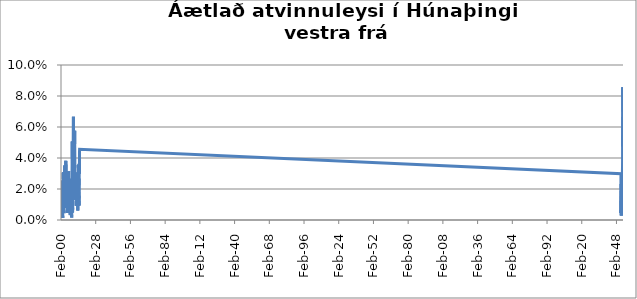
| Category | Series 0 |
|---|---|
| 2000-02-01 | 0.026 |
| 2000-03-01 | 0.024 |
| 2000-04-01 | 0.016 |
| 2000-05-01 | 0.006 |
| 2000-06-01 | 0.003 |
| 2000-07-01 | 0.001 |
| 2000-08-01 | 0.001 |
| 2000-09-01 | 0.004 |
| 2000-10-01 | 0.004 |
| 2000-11-01 | 0.006 |
| 2000-12-01 | 0.013 |
| 2001-01-01 | 0.013 |
| 2001-02-01 | 0.009 |
| 2001-03-01 | 0.013 |
| 2001-04-01 | 0.012 |
| 2001-05-01 | 0.006 |
| 2001-06-01 | 0.001 |
| 2001-07-01 | 0.001 |
| 2001-08-01 | 0.003 |
| 2001-09-01 | 0.003 |
| 2001-10-01 | 0.013 |
| 2001-11-01 | 0.017 |
| 2001-12-01 | 0.031 |
| 2002-01-01 | 0.026 |
| 2002-02-01 | 0.031 |
| 2002-03-01 | 0.023 |
| 2002-04-01 | 0.015 |
| 2002-05-01 | 0.012 |
| 2002-06-01 | 0.006 |
| 2002-07-01 | 0.004 |
| 2002-08-01 | 0.006 |
| 2002-09-01 | 0.012 |
| 2002-10-01 | 0.009 |
| 2002-11-01 | 0.019 |
| 2002-12-01 | 0.028 |
| 2003-01-01 | 0.032 |
| 2003-02-01 | 0.035 |
| 2003-03-01 | 0.025 |
| 2003-04-01 | 0.028 |
| 2003-05-01 | 0.021 |
| 2003-06-01 | 0.015 |
| 2003-07-01 | 0.016 |
| 2003-08-01 | 0.016 |
| 2003-09-01 | 0.019 |
| 2003-10-01 | 0.016 |
| 2003-11-01 | 0.027 |
| 2003-12-01 | 0.027 |
| 2004-01-01 | 0.038 |
| 2004-02-01 | 0.025 |
| 2004-03-01 | 0.024 |
| 2004-04-01 | 0.02 |
| 2004-05-01 | 0.02 |
| 2004-06-01 | 0.009 |
| 2004-07-01 | 0.008 |
| 2004-08-01 | 0.009 |
| 2004-09-01 | 0.008 |
| 2004-10-01 | 0.013 |
| 2004-11-01 | 0.025 |
| 2004-12-01 | 0.022 |
| 2005-01-01 | 0.025 |
| 2005-02-01 | 0.022 |
| 2005-03-01 | 0.022 |
| 2005-04-01 | 0.02 |
| 2005-05-01 | 0.008 |
| 2005-06-01 | 0.006 |
| 2005-07-01 | 0.005 |
| 2005-08-01 | 0.008 |
| 2005-09-01 | 0.005 |
| 2005-10-01 | 0.014 |
| 2005-11-01 | 0.024 |
| 2005-12-01 | 0.027 |
| 2006-01-01 | 0.024 |
| 2006-02-01 | 0.024 |
| 2006-03-01 | 0.028 |
| 2006-04-01 | 0.031 |
| 2006-05-01 | 0.012 |
| 2006-06-01 | 0.007 |
| 2006-07-01 | 0.006 |
| 2006-08-01 | 0.006 |
| 2006-09-01 | 0.006 |
| 2006-10-01 | 0.009 |
| 2006-11-01 | 0.012 |
| 2006-12-01 | 0.016 |
| 2007-01-01 | 0.027 |
| 2007-02-01 | 0.027 |
| 2007-03-01 | 0.02 |
| 2007-04-01 | 0.012 |
| 2007-05-01 | 0.008 |
| 2007-06-01 | 0.005 |
| 2007-07-01 | 0.005 |
| 2007-08-01 | 0.003 |
| 2007-09-01 | 0.006 |
| 2007-10-01 | 0.007 |
| 2007-11-01 | 0.007 |
| 2007-12-01 | 0.007 |
| 2008-01-01 | 0.008 |
| 2008-02-01 | 0.011 |
| 2008-03-01 | 0.015 |
| 2008-04-01 | 0.014 |
| 2008-05-01 | 0.012 |
| 2008-06-01 | 0.006 |
| 2008-07-01 | 0.006 |
| 2008-08-01 | 0.003 |
| 2008-09-01 | 0.002 |
| 2008-10-01 | 0.003 |
| 2008-11-01 | 0.013 |
| 2008-12-01 | 0.017 |
| 2009-01-01 | 0.03 |
| 2009-02-01 | 0.037 |
| 2009-03-01 | 0.051 |
| 2009-04-01 | 0.041 |
| 2009-05-01 | 0.031 |
| 2009-06-01 | 0.005 |
| 2009-07-01 | 0.008 |
| 2009-08-01 | 0.008 |
| 2009-09-01 | 0.015 |
| 2009-10-01 | 0.025 |
| 2009-11-01 | 0.042 |
| 2009-12-01 | 0.047 |
| 2010-01-01 | 0.061 |
| 2010-02-01 | 0.067 |
| 2010-03-01 | 0.061 |
| 2010-04-01 | 0.049 |
| 2010-05-01 | 0.031 |
| 2010-06-01 | 0.016 |
| 2010-07-01 | 0.02 |
| 2010-08-01 | 0.018 |
| 2010-09-01 | 0.013 |
| 2010-10-01 | 0.028 |
| 2010-11-01 | 0.038 |
| 2010-12-01 | 0.043 |
| 2011-01-01 | 0.054 |
| 2011-02-01 | 0.058 |
| 2011-03-01 | 0.049 |
| 2011-04-01 | 0.041 |
| 2011-05-01 | 0.021 |
| 2011-06-01 | 0.021 |
| 2011-07-01 | 0.019 |
| 2011-08-01 | 0.014 |
| 2011-09-01 | 0.014 |
| 2011-10-01 | 0.018 |
| 2011-11-01 | 0.025 |
| 2011-12-01 | 0.028 |
| 2012-01-01 | 0.026 |
| 2012-02-01 | 0.027 |
| 2012-03-01 | 0.021 |
| 2012-04-01 | 0.018 |
| 2012-05-01 | 0.017 |
| 2012-06-01 | 0.009 |
| 2012-07-01 | 0.012 |
| 2012-08-01 | 0.014 |
| 2012-09-01 | 0.016 |
| 2012-10-01 | 0.023 |
| 2012-11-01 | 0.031 |
| 2012-12-01 | 0.031 |
| 2013-01-01 | 0.027 |
| 2013-02-01 | 0.026 |
| 2013-03-01 | 0.013 |
| 2013-04-01 | 0.012 |
| 2013-05-01 | 0.012 |
| 2013-06-01 | 0.012 |
| 2013-07-01 | 0.012 |
| 2013-08-01 | 0.011 |
| 2013-09-01 | 0.006 |
| 2013-10-01 | 0.014 |
| 2013-11-01 | 0.019 |
| 2013-12-01 | 0.027 |
| 2014-01-01 | 0.036 |
| 2014-02-01 | 0.034 |
| 2014-03-01 | 0.031 |
| 2014-04-01 | 0.025 |
| 2014-05-01 | 0.014 |
| 2014-06-01 | 0.016 |
| 2014-07-01 | 0.016 |
| 2014-08-01 | 0.009 |
| 2014-09-01 | 0.009 |
| 2014-10-01 | 0.027 |
| 2014-11-01 | 0.036 |
| 2014-12-01 | 0.03 |
| 2015-01-01 | 0.044 |
| 2015-02-01 | 0.046 |
| 201503.0 | 0.03 |
| 201504.0 | 0.026 |
| 201505.0 | 0.012 |
| 201506.0 | 0.008 |
| 201507.0 | 0.008 |
| 201508.0 | 0.005 |
| 201509.0 | 0.006 |
| 201510.0 | 0.005 |
| 201511.0 | 0.012 |
| 201512.0 | 0.017 |
| 201601.0 | 0.02 |
| 201602.0 | 0.022 |
| 201603.0 | 0.023 |
| 201604.0 | 0.02 |
| 201605.0 | 0.012 |
| 201606.0 | 0.011 |
| 201607.0 | 0.006 |
| 201608.0 | 0.003 |
| 201609.0 | 0.006 |
| 201610.0 | 0.012 |
| 201611.0 | 0.013 |
| 201612.0 | 0.015 |
| 201701.0 | 0.016 |
| 201702.0 | 0.015 |
| 201703.0 | 0.01 |
| 201704.0 | 0.01 |
| 201705.0 | 0.009 |
| 201706.0 | 0.003 |
| 201707.0 | 0.004 |
| 201708.0 | 0.006 |
| 201709.0 | 0.007 |
| 201710.0 | 0.013 |
| 201711.0 | 0.016 |
| 201712.0 | 0.018 |
| 201801.0 | 0.024 |
| 201802.0 | 0.021 |
| 201803.0 | 0.016 |
| 201804.0 | 0.013 |
| 201805.0 | 0.012 |
| 201806.0 | 0.007 |
| 201807.0 | 0.009 |
| 201808.0 | 0.011 |
| 201809.0 | 0.012 |
| 201810.0 | 0.012 |
| 201811.0 | 0.021 |
| 201812.0 | 0.024 |
| 201901.0 | 0.025 |
| 201902.0 | 0.022 |
| 201903.0 | 0.021 |
| 201904.0 | 0.016 |
| 201905.0 | 0.013 |
| 201906.0 | 0.013 |
| 201907.0 | 0.018 |
| 201908.0 | 0.02 |
| 201909.0 | 0.017 |
| 201910.0 | 0.025 |
| 201911.0 | 0.022 |
| 201912.0 | 0.028 |
| 202001.0 | 0.038 |
| 202002.0 | 0.038 |
| 202003.0 | 0.054 |
| 202004.0 | 0.05 |
| 202005.0 | 0.052 |
| 202006.0 | 0.052 |
| 202007.0 | 0.052 |
| 202008.0 | 0.052 |
| 202009.0 | 0.048 |
| 202010.0 | 0.067 |
| 202011.0 | 0.075 |
| 202012.0 | 0.086 |
| 202101.0 | 0.082 |
| 202102.0 | 0.079 |
| 202103.0 | 0.084 |
| 202104.0 | 0.07 |
| 202105.0 | 0.055 |
| 202106.0 | 0.043 |
| 202107.0 | 0.035 |
| 202108.0 | 0.027 |
| 202109.0 | 0.026 |